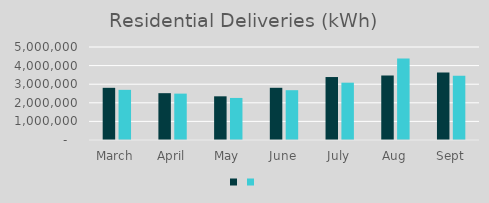
| Category | Series 1 | Series 0 |
|---|---|---|
| March | 2805250 | 2696163 |
| April | 2517652 | 2493703 |
| May | 2348338 | 2261286 |
| June | 2806791 | 2677737 |
| July | 3385366 | 3081914 |
| Aug | 3470448 | 4380548 |
| Sept | 3631455 | 3458199 |